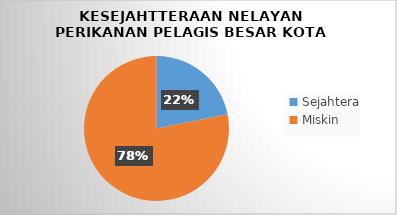
| Category | Series 0 |
|---|---|
| Sejahtera | 7 |
| Miskin | 25 |